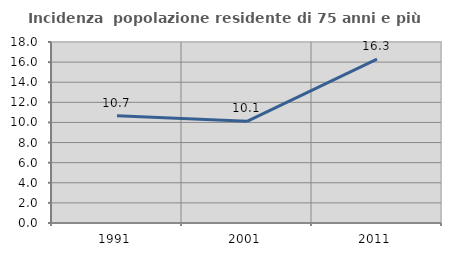
| Category | Incidenza  popolazione residente di 75 anni e più |
|---|---|
| 1991.0 | 10.667 |
| 2001.0 | 10.11 |
| 2011.0 | 16.288 |